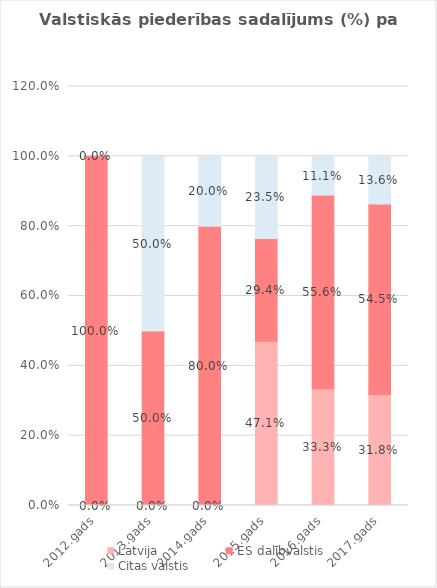
| Category | Latvija | ES dalībvalstis | Citas valstis |
|---|---|---|---|
| 2012.gads | 0 | 1 | 0 |
| 2013.gads | 0 | 0.5 | 0.5 |
| 2014.gads | 0 | 0.8 | 0.2 |
| 2015.gads | 0.471 | 0.294 | 0.235 |
| 2016.gads | 0.333 | 0.556 | 0.111 |
| 2017.gads | 0.318 | 0.545 | 0.136 |